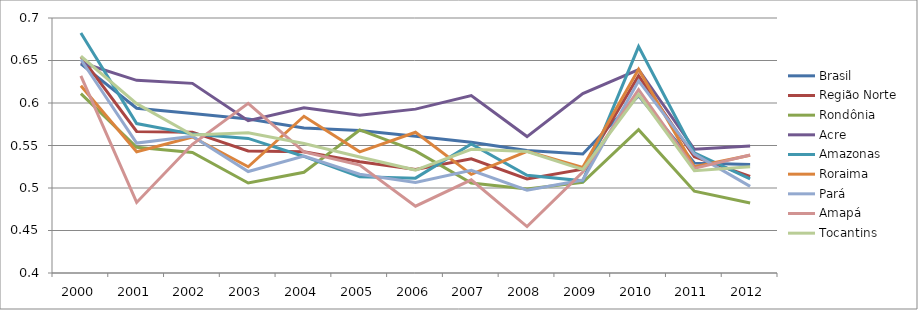
| Category | Brasil | Região Norte | Rondônia | Acre | Amazonas | Roraima | Pará | Amapá | Tocantins |
|---|---|---|---|---|---|---|---|---|---|
| 2000.0 | 0.646 | 0.654 | 0.611 | 0.648 | 0.682 | 0.62 | 0.651 | 0.632 | 0.655 |
| 2001.0 | 0.594 | 0.566 | 0.548 | 0.627 | 0.576 | 0.543 | 0.553 | 0.483 | 0.599 |
| 2002.0 | 0.588 | 0.566 | 0.542 | 0.623 | 0.563 | 0.56 | 0.561 | 0.551 | 0.562 |
| 2003.0 | 0.581 | 0.544 | 0.506 | 0.579 | 0.558 | 0.525 | 0.519 | 0.6 | 0.565 |
| 2004.0 | 0.57 | 0.543 | 0.518 | 0.594 | 0.537 | 0.584 | 0.538 | 0.542 | 0.552 |
| 2005.0 | 0.568 | 0.531 | 0.568 | 0.586 | 0.513 | 0.542 | 0.516 | 0.527 | 0.536 |
| 2006.0 | 0.561 | 0.522 | 0.544 | 0.593 | 0.512 | 0.566 | 0.506 | 0.479 | 0.521 |
| 2007.0 | 0.554 | 0.534 | 0.506 | 0.609 | 0.552 | 0.516 | 0.521 | 0.51 | 0.546 |
| 2008.0 | 0.544 | 0.511 | 0.499 | 0.56 | 0.515 | 0.543 | 0.498 | 0.455 | 0.543 |
| 2009.0 | 0.54 | 0.522 | 0.507 | 0.611 | 0.508 | 0.524 | 0.509 | 0.519 | 0.522 |
| 2010.0 | 0.609 | 0.632 | 0.569 | 0.639 | 0.666 | 0.64 | 0.626 | 0.616 | 0.61 |
| 2011.0 | 0.529 | 0.537 | 0.496 | 0.546 | 0.541 | 0.525 | 0.54 | 0.523 | 0.52 |
| 2012.0 | 0.528 | 0.514 | 0.482 | 0.55 | 0.511 | 0.539 | 0.502 | 0.539 | 0.525 |